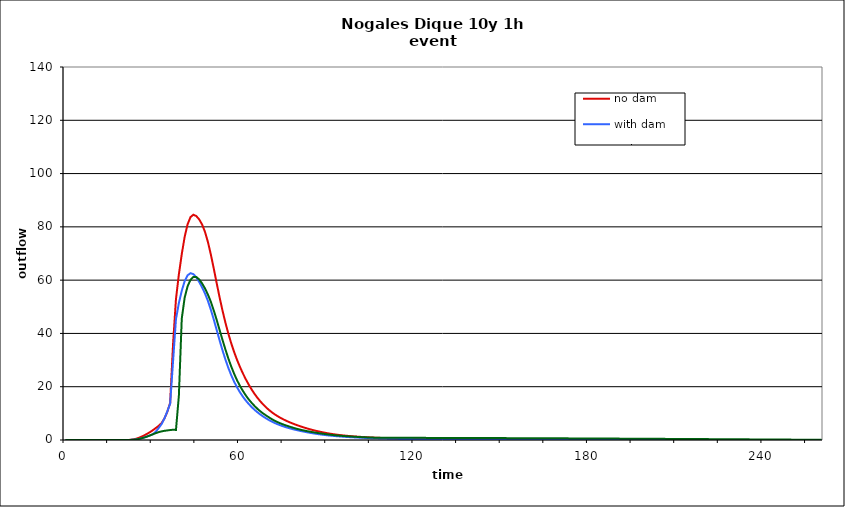
| Category | no dam | with dam | with dam/pond |
|---|---|---|---|
| 0.0 | 0 | 0 | 0 |
| 1.0 | 0 | 0 | 0 |
| 2.0 | 0 | 0 | 0 |
| 3.0 | 0 | 0 | 0 |
| 4.0 | 0 | 0 | 0 |
| 5.0 | 0 | 0 | 0 |
| 6.0 | 0 | 0 | 0 |
| 7.0 | 0 | 0 | 0 |
| 8.0 | 0 | 0 | 0 |
| 9.0 | 0 | 0 | 0 |
| 10.0 | 0 | 0 | 0 |
| 11.0 | 0 | 0 | 0 |
| 12.0 | 0 | 0 | 0 |
| 13.0 | 0 | 0 | 0 |
| 14.0 | 0 | 0 | 0 |
| 15.0 | 0 | 0 | 0 |
| 16.0 | 0 | 0 | 0 |
| 17.0 | 0 | 0 | 0 |
| 18.0 | 0.001 | 0 | 0 |
| 19.0 | 0.002 | 0.001 | 0.001 |
| 20.0 | 0.003 | 0.001 | 0.001 |
| 21.0 | 0.01 | 0.004 | 0.004 |
| 22.0 | 0.045 | 0.021 | 0.021 |
| 23.0 | 0.148 | 0.071 | 0.071 |
| 24.0 | 0.372 | 0.174 | 0.172 |
| 25.0 | 0.727 | 0.345 | 0.343 |
| 26.0 | 1.174 | 0.594 | 0.592 |
| 27.0 | 1.689 | 0.911 | 0.908 |
| 28.0 | 2.265 | 1.278 | 1.274 |
| 29.0 | 2.912 | 1.687 | 1.68 |
| 30.0 | 3.634 | 2.15 | 2.119 |
| 31.0 | 4.437 | 3.033 | 2.557 |
| 32.0 | 5.266 | 4.402 | 2.932 |
| 33.0 | 6.26 | 5.889 | 3.222 |
| 34.0 | 8.009 | 7.997 | 3.433 |
| 35.0 | 10.493 | 10.664 | 3.596 |
| 36.0 | 13.941 | 13.633 | 3.737 |
| 37.0 | 35.958 | 29.474 | 3.847 |
| 38.0 | 52.866 | 45.338 | 3.776 |
| 39.0 | 62.16 | 51.397 | 16.629 |
| 40.0 | 69.789 | 56.031 | 45.616 |
| 41.0 | 76.296 | 59.645 | 53.483 |
| 42.0 | 80.969 | 61.821 | 57.71 |
| 43.0 | 83.663 | 62.607 | 60.112 |
| 44.0 | 84.563 | 62.264 | 61.21 |
| 45.0 | 84.05 | 61.023 | 61.169 |
| 46.0 | 82.786 | 59.278 | 60.251 |
| 47.0 | 80.86 | 57.284 | 58.748 |
| 48.0 | 78.068 | 54.95 | 56.851 |
| 49.0 | 74.285 | 52.18 | 54.563 |
| 50.0 | 69.607 | 48.898 | 51.86 |
| 51.0 | 64.343 | 45.214 | 48.625 |
| 52.0 | 58.883 | 41.316 | 45.087 |
| 53.0 | 53.568 | 37.412 | 41.318 |
| 54.0 | 48.601 | 33.682 | 37.579 |
| 55.0 | 44.065 | 30.232 | 33.993 |
| 56.0 | 39.976 | 27.11 | 30.643 |
| 57.0 | 36.314 | 24.331 | 27.595 |
| 58.0 | 33.034 | 21.895 | 24.861 |
| 59.0 | 30.093 | 19.773 | 22.438 |
| 60.0 | 27.444 | 17.924 | 20.311 |
| 61.0 | 25.038 | 16.293 | 18.457 |
| 62.0 | 22.836 | 14.841 | 16.759 |
| 63.0 | 20.827 | 13.548 | 15.265 |
| 64.0 | 19.002 | 12.391 | 13.971 |
| 65.0 | 17.352 | 11.354 | 12.795 |
| 66.0 | 15.862 | 10.423 | 11.72 |
| 67.0 | 14.522 | 9.579 | 10.773 |
| 68.0 | 13.313 | 8.812 | 9.942 |
| 69.0 | 12.227 | 8.112 | 9.194 |
| 70.0 | 11.255 | 7.474 | 8.483 |
| 71.0 | 10.387 | 6.894 | 7.804 |
| 72.0 | 9.609 | 6.372 | 7.198 |
| 73.0 | 8.91 | 5.901 | 6.672 |
| 74.0 | 8.279 | 5.477 | 6.208 |
| 75.0 | 7.705 | 5.093 | 5.792 |
| 76.0 | 7.18 | 4.743 | 5.414 |
| 77.0 | 6.695 | 4.422 | 5.054 |
| 78.0 | 6.245 | 4.126 | 4.7 |
| 79.0 | 5.824 | 3.85 | 4.368 |
| 80.0 | 5.427 | 3.594 | 4.071 |
| 81.0 | 5.052 | 3.354 | 3.806 |
| 82.0 | 4.699 | 3.129 | 3.566 |
| 83.0 | 4.366 | 2.918 | 3.345 |
| 84.0 | 4.053 | 2.72 | 3.139 |
| 85.0 | 3.76 | 2.532 | 2.946 |
| 86.0 | 3.486 | 2.355 | 2.765 |
| 87.0 | 3.23 | 2.19 | 2.595 |
| 88.0 | 2.992 | 2.036 | 2.435 |
| 89.0 | 2.77 | 1.898 | 2.281 |
| 90.0 | 2.563 | 1.772 | 2.132 |
| 91.0 | 2.372 | 1.657 | 1.992 |
| 92.0 | 2.199 | 1.551 | 1.866 |
| 93.0 | 2.045 | 1.453 | 1.753 |
| 94.0 | 1.906 | 1.362 | 1.65 |
| 95.0 | 1.779 | 1.278 | 1.557 |
| 96.0 | 1.663 | 1.2 | 1.471 |
| 97.0 | 1.557 | 1.127 | 1.391 |
| 98.0 | 1.46 | 1.06 | 1.317 |
| 99.0 | 1.37 | 0.997 | 1.248 |
| 100.0 | 1.288 | 0.938 | 1.184 |
| 101.0 | 1.212 | 0.884 | 1.124 |
| 102.0 | 1.141 | 0.833 | 1.068 |
| 103.0 | 1.075 | 0.786 | 1.015 |
| 104.0 | 1.014 | 0.741 | 0.966 |
| 105.0 | 0.958 | 0.7 | 0.922 |
| 106.0 | 0.905 | 0.662 | 0.886 |
| 107.0 | 0.855 | 0.626 | 0.86 |
| 108.0 | 0.809 | 0.592 | 0.843 |
| 109.0 | 0.766 | 0.56 | 0.834 |
| 110.0 | 0.725 | 0.531 | 0.829 |
| 111.0 | 0.687 | 0.503 | 0.827 |
| 112.0 | 0.652 | 0.477 | 0.824 |
| 113.0 | 0.618 | 0.453 | 0.823 |
| 114.0 | 0.587 | 0.43 | 0.821 |
| 115.0 | 0.557 | 0.408 | 0.819 |
| 116.0 | 0.53 | 0.388 | 0.816 |
| 117.0 | 0.504 | 0.369 | 0.814 |
| 118.0 | 0.479 | 0.351 | 0.812 |
| 119.0 | 0.456 | 0.334 | 0.81 |
| 120.0 | 0.434 | 0.319 | 0.807 |
| 121.0 | 0.414 | 0.304 | 0.805 |
| 122.0 | 0.395 | 0.29 | 0.802 |
| 123.0 | 0.376 | 0.276 | 0.799 |
| 124.0 | 0.359 | 0.264 | 0.797 |
| 125.0 | 0.343 | 0.252 | 0.794 |
| 126.0 | 0.327 | 0.241 | 0.791 |
| 127.0 | 0.313 | 0.23 | 0.788 |
| 128.0 | 0.299 | 0.22 | 0.785 |
| 129.0 | 0.286 | 0.211 | 0.782 |
| 130.0 | 0.274 | 0.202 | 0.779 |
| 131.0 | 0.262 | 0.193 | 0.776 |
| 132.0 | 0.251 | 0.185 | 0.773 |
| 133.0 | 0.24 | 0.178 | 0.77 |
| 134.0 | 0.23 | 0.17 | 0.766 |
| 135.0 | 0.22 | 0.163 | 0.763 |
| 136.0 | 0.211 | 0.157 | 0.76 |
| 137.0 | 0.203 | 0.151 | 0.757 |
| 138.0 | 0.194 | 0.145 | 0.753 |
| 139.0 | 0.187 | 0.139 | 0.75 |
| 140.0 | 0.179 | 0.134 | 0.746 |
| 141.0 | 0.172 | 0.128 | 0.743 |
| 142.0 | 0.165 | 0.124 | 0.739 |
| 143.0 | 0.159 | 0.119 | 0.736 |
| 144.0 | 0.153 | 0.114 | 0.732 |
| 145.0 | 0.147 | 0.11 | 0.728 |
| 146.0 | 0.141 | 0.106 | 0.725 |
| 147.0 | 0.136 | 0.102 | 0.721 |
| 148.0 | 0.131 | 0.098 | 0.717 |
| 149.0 | 0.126 | 0.095 | 0.714 |
| 150.0 | 0.121 | 0.091 | 0.71 |
| 151.0 | 0.117 | 0.088 | 0.706 |
| 152.0 | 0.112 | 0.085 | 0.702 |
| 153.0 | 0.108 | 0.082 | 0.698 |
| 154.0 | 0.104 | 0.079 | 0.695 |
| 155.0 | 0.101 | 0.077 | 0.691 |
| 156.0 | 0.097 | 0.074 | 0.687 |
| 157.0 | 0.094 | 0.072 | 0.683 |
| 158.0 | 0.09 | 0.069 | 0.679 |
| 159.0 | 0.087 | 0.067 | 0.675 |
| 160.0 | 0.084 | 0.065 | 0.671 |
| 161.0 | 0.081 | 0.062 | 0.666 |
| 162.0 | 0.078 | 0.06 | 0.662 |
| 163.0 | 0.076 | 0.058 | 0.658 |
| 164.0 | 0.073 | 0.057 | 0.653 |
| 165.0 | 0.07 | 0.055 | 0.649 |
| 166.0 | 0.068 | 0.053 | 0.644 |
| 167.0 | 0.066 | 0.051 | 0.639 |
| 168.0 | 0.064 | 0.05 | 0.634 |
| 169.0 | 0.061 | 0.048 | 0.629 |
| 170.0 | 0.059 | 0.047 | 0.624 |
| 171.0 | 0.057 | 0.045 | 0.619 |
| 172.0 | 0.055 | 0.044 | 0.614 |
| 173.0 | 0.054 | 0.043 | 0.609 |
| 174.0 | 0.052 | 0.041 | 0.603 |
| 175.0 | 0.05 | 0.04 | 0.598 |
| 176.0 | 0.049 | 0.039 | 0.593 |
| 177.0 | 0.047 | 0.038 | 0.588 |
| 178.0 | 0.045 | 0.037 | 0.583 |
| 179.0 | 0.044 | 0.036 | 0.577 |
| 180.0 | 0.043 | 0.035 | 0.572 |
| 181.0 | 0.041 | 0.034 | 0.567 |
| 182.0 | 0.04 | 0.033 | 0.562 |
| 183.0 | 0.039 | 0.032 | 0.556 |
| 184.0 | 0.038 | 0.031 | 0.551 |
| 185.0 | 0.036 | 0.03 | 0.546 |
| 186.0 | 0.035 | 0.029 | 0.54 |
| 187.0 | 0.034 | 0.029 | 0.535 |
| 188.0 | 0.033 | 0.028 | 0.529 |
| 189.0 | 0.032 | 0.027 | 0.524 |
| 190.0 | 0.031 | 0.026 | 0.518 |
| 191.0 | 0.03 | 0.026 | 0.513 |
| 192.0 | 0.029 | 0.025 | 0.507 |
| 193.0 | 0.028 | 0.024 | 0.502 |
| 194.0 | 0.027 | 0.024 | 0.496 |
| 195.0 | 0.027 | 0.023 | 0.491 |
| 196.0 | 0.026 | 0.022 | 0.485 |
| 197.0 | 0.025 | 0.022 | 0.479 |
| 198.0 | 0.024 | 0.021 | 0.473 |
| 199.0 | 0.024 | 0.021 | 0.467 |
| 200.0 | 0.023 | 0.02 | 0.461 |
| 201.0 | 0.022 | 0.02 | 0.455 |
| 202.0 | 0.022 | 0.019 | 0.449 |
| 203.0 | 0.021 | 0.019 | 0.442 |
| 204.0 | 0.02 | 0.018 | 0.436 |
| 205.0 | 0.02 | 0.018 | 0.43 |
| 206.0 | 0.019 | 0.017 | 0.424 |
| 207.0 | 0.019 | 0.017 | 0.417 |
| 208.0 | 0.018 | 0.017 | 0.411 |
| 209.0 | 0.017 | 0.016 | 0.405 |
| 210.0 | 0.017 | 0.016 | 0.399 |
| 211.0 | 0.016 | 0.015 | 0.392 |
| 212.0 | 0.016 | 0.015 | 0.386 |
| 213.0 | 0.016 | 0.015 | 0.38 |
| 214.0 | 0.015 | 0.014 | 0.374 |
| 215.0 | 0.015 | 0.014 | 0.367 |
| 216.0 | 0.014 | 0.014 | 0.361 |
| 217.0 | 0.014 | 0.013 | 0.355 |
| 218.0 | 0.013 | 0.013 | 0.348 |
| 219.0 | 0.013 | 0.013 | 0.342 |
| 220.0 | 0.012 | 0.012 | 0.335 |
| 221.0 | 0.012 | 0.012 | 0.329 |
| 222.0 | 0.012 | 0.012 | 0.323 |
| 223.0 | 0.011 | 0.012 | 0.316 |
| 224.0 | 0.011 | 0.011 | 0.31 |
| 225.0 | 0.01 | 0.011 | 0.303 |
| 226.0 | 0.01 | 0.011 | 0.296 |
| 227.0 | 0.01 | 0.01 | 0.289 |
| 228.0 | 0.009 | 0.01 | 0.283 |
| 229.0 | 0.009 | 0.01 | 0.276 |
| 230.0 | 0.009 | 0.01 | 0.269 |
| 231.0 | 0.008 | 0.009 | 0.262 |
| 232.0 | 0.008 | 0.009 | 0.255 |
| 233.0 | 0.008 | 0.009 | 0.249 |
| 234.0 | 0.007 | 0.009 | 0.242 |
| 235.0 | 0.007 | 0.008 | 0.235 |
| 236.0 | 0.007 | 0.008 | 0.229 |
| 237.0 | 0.006 | 0.008 | 0.222 |
| 238.0 | 0.006 | 0.008 | 0.215 |
| 239.0 | 0.006 | 0.008 | 0.209 |
| 240.0 | 0.006 | 0.007 | 0.202 |
| 241.0 | 0.005 | 0.007 | 0.196 |
| 242.0 | 0.005 | 0.007 | 0.19 |
| 243.0 | 0.005 | 0.007 | 0.183 |
| 244.0 | 0.004 | 0.006 | 0.177 |
| 245.0 | 0.004 | 0.006 | 0.171 |
| 246.0 | 0.004 | 0.006 | 0.164 |
| 247.0 | 0.004 | 0.006 | 0.158 |
| 248.0 | 0.004 | 0.006 | 0.151 |
| 249.0 | 0.003 | 0.006 | 0.144 |
| 250.0 | 0.003 | 0.005 | 0.137 |
| 251.0 | 0.003 | 0.005 | 0.13 |
| 252.0 | 0.003 | 0.005 | 0.123 |
| 253.0 | 0.003 | 0.005 | 0.117 |
| 254.0 | 0.002 | 0.005 | 0.11 |
| 255.0 | 0.002 | 0.005 | 0.104 |
| 256.0 | 0.002 | 0.004 | 0.098 |
| 257.0 | 0.002 | 0.004 | 0.092 |
| 258.0 | 0.002 | 0.004 | 0.087 |
| 259.0 | 0.002 | 0.004 | 0.082 |
| 260.0 | 0.001 | 0.004 | 0.077 |